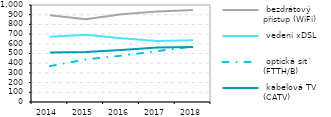
| Category |  bezdrátový přístup (WiFi) |  vedení xDSL |  optická sít´ (FTTH/B) |  kabelová TV (CATV) |
|---|---|---|---|---|
| 2014.0 | 895.535 | 672.28 | 369.501 | 509.873 |
| 2015.0 | 852.228 | 693.056 | 438.689 | 516.46 |
| 2016.0 | 905.535 | 656.9 | 477.459 | 537.262 |
| 2017.0 | 933.545 | 629.296 | 524.987 | 561.192 |
| 2018.0 | 949.161 | 637.204 | 572.736 | 567.555 |